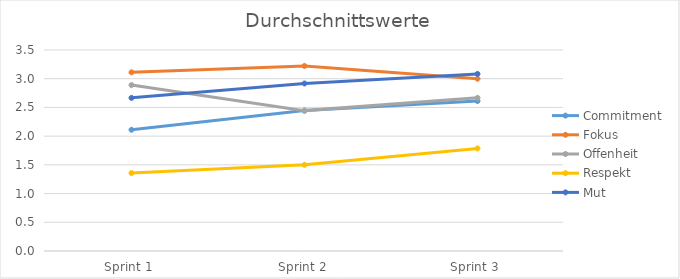
| Category | Commitment | Fokus | Offenheit | Respekt | Mut |
|---|---|---|---|---|---|
| Sprint 1 | 2.111 | 3.111 | 2.889 | 1.357 | 2.667 |
| Sprint 2 | 2.444 | 3.222 | 2.444 | 1.5 | 2.917 |
| Sprint 3 | 2.611 | 3 | 2.667 | 1.786 | 3.083 |